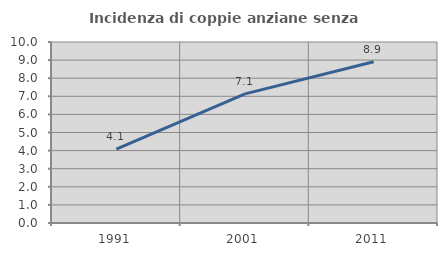
| Category | Incidenza di coppie anziane senza figli  |
|---|---|
| 1991.0 | 4.078 |
| 2001.0 | 7.132 |
| 2011.0 | 8.909 |